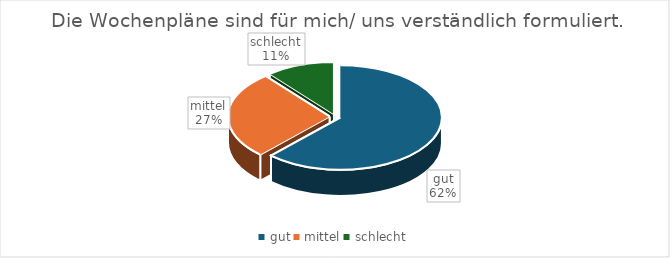
| Category | Series 0 |
|---|---|
| gut | 57 |
| mittel | 25 |
| schlecht | 10 |